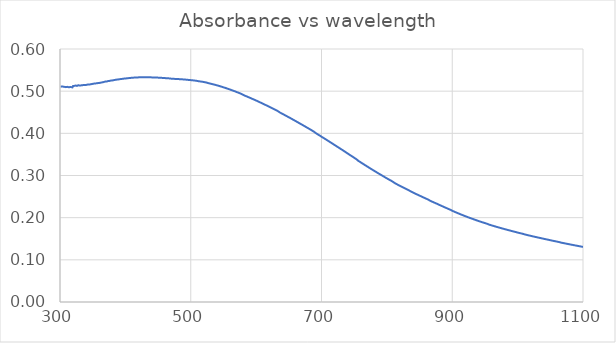
| Category | Series 0 |
|---|---|
| 1100.0 | 0.131 |
| 1099.0 | 0.131 |
| 1098.0 | 0.131 |
| 1097.0 | 0.131 |
| 1096.0 | 0.132 |
| 1095.0 | 0.132 |
| 1094.0 | 0.132 |
| 1093.0 | 0.133 |
| 1092.0 | 0.133 |
| 1091.0 | 0.133 |
| 1090.0 | 0.134 |
| 1089.0 | 0.134 |
| 1088.0 | 0.134 |
| 1087.0 | 0.135 |
| 1086.0 | 0.135 |
| 1085.0 | 0.135 |
| 1084.0 | 0.135 |
| 1083.0 | 0.136 |
| 1082.0 | 0.136 |
| 1081.0 | 0.136 |
| 1080.0 | 0.137 |
| 1079.0 | 0.137 |
| 1078.0 | 0.137 |
| 1077.0 | 0.138 |
| 1076.0 | 0.138 |
| 1075.0 | 0.138 |
| 1074.0 | 0.139 |
| 1073.0 | 0.139 |
| 1072.0 | 0.139 |
| 1071.0 | 0.139 |
| 1070.0 | 0.14 |
| 1069.0 | 0.14 |
| 1068.0 | 0.14 |
| 1067.0 | 0.141 |
| 1066.0 | 0.141 |
| 1065.0 | 0.141 |
| 1064.0 | 0.142 |
| 1063.0 | 0.142 |
| 1062.0 | 0.143 |
| 1061.0 | 0.143 |
| 1060.0 | 0.143 |
| 1059.0 | 0.144 |
| 1058.0 | 0.144 |
| 1057.0 | 0.144 |
| 1056.0 | 0.145 |
| 1055.0 | 0.145 |
| 1054.0 | 0.145 |
| 1053.0 | 0.146 |
| 1052.0 | 0.146 |
| 1051.0 | 0.146 |
| 1050.0 | 0.147 |
| 1049.0 | 0.147 |
| 1048.0 | 0.147 |
| 1047.0 | 0.148 |
| 1046.0 | 0.148 |
| 1045.0 | 0.148 |
| 1044.0 | 0.149 |
| 1043.0 | 0.149 |
| 1042.0 | 0.149 |
| 1041.0 | 0.15 |
| 1040.0 | 0.15 |
| 1039.0 | 0.15 |
| 1038.0 | 0.151 |
| 1037.0 | 0.151 |
| 1036.0 | 0.151 |
| 1035.0 | 0.152 |
| 1034.0 | 0.152 |
| 1033.0 | 0.152 |
| 1032.0 | 0.153 |
| 1031.0 | 0.153 |
| 1030.0 | 0.153 |
| 1029.0 | 0.154 |
| 1028.0 | 0.154 |
| 1027.0 | 0.154 |
| 1026.0 | 0.155 |
| 1025.0 | 0.155 |
| 1024.0 | 0.155 |
| 1023.0 | 0.156 |
| 1022.0 | 0.156 |
| 1021.0 | 0.157 |
| 1020.0 | 0.157 |
| 1019.0 | 0.157 |
| 1018.0 | 0.158 |
| 1017.0 | 0.158 |
| 1016.0 | 0.158 |
| 1015.0 | 0.159 |
| 1014.0 | 0.159 |
| 1013.0 | 0.159 |
| 1012.0 | 0.16 |
| 1011.0 | 0.16 |
| 1010.0 | 0.161 |
| 1009.0 | 0.161 |
| 1008.0 | 0.162 |
| 1007.0 | 0.162 |
| 1006.0 | 0.162 |
| 1005.0 | 0.163 |
| 1004.0 | 0.163 |
| 1003.0 | 0.164 |
| 1002.0 | 0.164 |
| 1001.0 | 0.164 |
| 1000.0 | 0.165 |
| 999.0 | 0.165 |
| 998.0 | 0.166 |
| 997.0 | 0.166 |
| 996.0 | 0.166 |
| 995.0 | 0.167 |
| 994.0 | 0.167 |
| 993.0 | 0.168 |
| 992.0 | 0.168 |
| 991.0 | 0.168 |
| 990.0 | 0.169 |
| 989.0 | 0.169 |
| 988.0 | 0.17 |
| 987.0 | 0.17 |
| 986.0 | 0.17 |
| 985.0 | 0.171 |
| 984.0 | 0.171 |
| 983.0 | 0.172 |
| 982.0 | 0.172 |
| 981.0 | 0.172 |
| 980.0 | 0.173 |
| 979.0 | 0.173 |
| 978.0 | 0.174 |
| 977.0 | 0.174 |
| 976.0 | 0.175 |
| 975.0 | 0.175 |
| 974.0 | 0.175 |
| 973.0 | 0.176 |
| 972.0 | 0.176 |
| 971.0 | 0.177 |
| 970.0 | 0.177 |
| 969.0 | 0.178 |
| 968.0 | 0.178 |
| 967.0 | 0.179 |
| 966.0 | 0.179 |
| 965.0 | 0.18 |
| 964.0 | 0.18 |
| 963.0 | 0.18 |
| 962.0 | 0.181 |
| 961.0 | 0.181 |
| 960.0 | 0.182 |
| 959.0 | 0.182 |
| 958.0 | 0.183 |
| 957.0 | 0.183 |
| 956.0 | 0.184 |
| 955.0 | 0.185 |
| 954.0 | 0.185 |
| 953.0 | 0.186 |
| 952.0 | 0.186 |
| 951.0 | 0.187 |
| 950.0 | 0.187 |
| 949.0 | 0.188 |
| 948.0 | 0.188 |
| 947.0 | 0.189 |
| 946.0 | 0.189 |
| 945.0 | 0.19 |
| 944.0 | 0.19 |
| 943.0 | 0.191 |
| 942.0 | 0.191 |
| 941.0 | 0.192 |
| 940.0 | 0.192 |
| 939.0 | 0.193 |
| 938.0 | 0.193 |
| 937.0 | 0.194 |
| 936.0 | 0.194 |
| 935.0 | 0.195 |
| 934.0 | 0.195 |
| 933.0 | 0.196 |
| 932.0 | 0.197 |
| 931.0 | 0.197 |
| 930.0 | 0.198 |
| 929.0 | 0.198 |
| 928.0 | 0.199 |
| 927.0 | 0.199 |
| 926.0 | 0.2 |
| 925.0 | 0.201 |
| 924.0 | 0.201 |
| 923.0 | 0.202 |
| 922.0 | 0.202 |
| 921.0 | 0.203 |
| 920.0 | 0.204 |
| 919.0 | 0.204 |
| 918.0 | 0.205 |
| 917.0 | 0.205 |
| 916.0 | 0.206 |
| 915.0 | 0.207 |
| 914.0 | 0.207 |
| 913.0 | 0.208 |
| 912.0 | 0.208 |
| 911.0 | 0.209 |
| 910.0 | 0.21 |
| 909.0 | 0.21 |
| 908.0 | 0.211 |
| 907.0 | 0.212 |
| 906.0 | 0.212 |
| 905.0 | 0.213 |
| 904.0 | 0.214 |
| 903.0 | 0.214 |
| 902.0 | 0.215 |
| 901.0 | 0.216 |
| 900.0 | 0.216 |
| 899.0 | 0.218 |
| 898.0 | 0.218 |
| 897.0 | 0.219 |
| 896.0 | 0.219 |
| 895.0 | 0.22 |
| 894.0 | 0.221 |
| 893.0 | 0.222 |
| 892.0 | 0.222 |
| 891.0 | 0.223 |
| 890.0 | 0.224 |
| 889.0 | 0.224 |
| 888.0 | 0.225 |
| 887.0 | 0.226 |
| 886.0 | 0.226 |
| 885.0 | 0.227 |
| 884.0 | 0.228 |
| 883.0 | 0.228 |
| 882.0 | 0.229 |
| 881.0 | 0.23 |
| 880.0 | 0.23 |
| 879.0 | 0.231 |
| 878.0 | 0.232 |
| 877.0 | 0.233 |
| 876.0 | 0.233 |
| 875.0 | 0.234 |
| 874.0 | 0.235 |
| 873.0 | 0.235 |
| 872.0 | 0.236 |
| 871.0 | 0.237 |
| 870.0 | 0.237 |
| 869.0 | 0.238 |
| 868.0 | 0.239 |
| 867.0 | 0.24 |
| 866.0 | 0.24 |
| 865.0 | 0.241 |
| 864.0 | 0.242 |
| 863.0 | 0.243 |
| 862.0 | 0.244 |
| 861.0 | 0.244 |
| 860.0 | 0.245 |
| 859.0 | 0.246 |
| 858.0 | 0.247 |
| 857.0 | 0.247 |
| 856.0 | 0.248 |
| 855.0 | 0.249 |
| 854.0 | 0.249 |
| 853.0 | 0.25 |
| 852.0 | 0.251 |
| 851.0 | 0.252 |
| 850.0 | 0.252 |
| 849.0 | 0.253 |
| 848.0 | 0.254 |
| 847.0 | 0.254 |
| 846.0 | 0.255 |
| 845.0 | 0.256 |
| 844.0 | 0.257 |
| 843.0 | 0.257 |
| 842.0 | 0.258 |
| 841.0 | 0.259 |
| 840.0 | 0.26 |
| 839.0 | 0.26 |
| 838.0 | 0.261 |
| 837.0 | 0.262 |
| 836.0 | 0.263 |
| 835.0 | 0.264 |
| 834.0 | 0.264 |
| 833.0 | 0.265 |
| 832.0 | 0.266 |
| 831.0 | 0.267 |
| 830.0 | 0.268 |
| 829.0 | 0.269 |
| 828.0 | 0.269 |
| 827.0 | 0.27 |
| 826.0 | 0.271 |
| 825.0 | 0.272 |
| 824.0 | 0.272 |
| 823.0 | 0.273 |
| 822.0 | 0.274 |
| 821.0 | 0.275 |
| 820.0 | 0.275 |
| 819.0 | 0.276 |
| 818.0 | 0.277 |
| 817.0 | 0.278 |
| 816.0 | 0.279 |
| 815.0 | 0.28 |
| 814.0 | 0.28 |
| 813.0 | 0.281 |
| 812.0 | 0.282 |
| 811.0 | 0.283 |
| 810.0 | 0.284 |
| 809.0 | 0.285 |
| 808.0 | 0.286 |
| 807.0 | 0.287 |
| 806.0 | 0.288 |
| 805.0 | 0.289 |
| 804.0 | 0.29 |
| 803.0 | 0.291 |
| 802.0 | 0.291 |
| 801.0 | 0.292 |
| 800.0 | 0.293 |
| 799.0 | 0.294 |
| 798.0 | 0.295 |
| 797.0 | 0.296 |
| 796.0 | 0.297 |
| 795.0 | 0.298 |
| 794.0 | 0.299 |
| 793.0 | 0.3 |
| 792.0 | 0.301 |
| 791.0 | 0.301 |
| 790.0 | 0.302 |
| 789.0 | 0.303 |
| 788.0 | 0.304 |
| 787.0 | 0.305 |
| 786.0 | 0.306 |
| 785.0 | 0.307 |
| 784.0 | 0.308 |
| 783.0 | 0.309 |
| 782.0 | 0.31 |
| 781.0 | 0.311 |
| 780.0 | 0.312 |
| 779.0 | 0.313 |
| 778.0 | 0.314 |
| 777.0 | 0.314 |
| 776.0 | 0.315 |
| 775.0 | 0.316 |
| 774.0 | 0.317 |
| 773.0 | 0.318 |
| 772.0 | 0.319 |
| 771.0 | 0.32 |
| 770.0 | 0.321 |
| 769.0 | 0.322 |
| 768.0 | 0.323 |
| 767.0 | 0.324 |
| 766.0 | 0.325 |
| 765.0 | 0.326 |
| 764.0 | 0.327 |
| 763.0 | 0.328 |
| 762.0 | 0.329 |
| 761.0 | 0.33 |
| 760.0 | 0.331 |
| 759.0 | 0.332 |
| 758.0 | 0.333 |
| 757.0 | 0.334 |
| 756.0 | 0.335 |
| 755.0 | 0.337 |
| 754.0 | 0.338 |
| 753.0 | 0.339 |
| 752.0 | 0.34 |
| 751.0 | 0.341 |
| 750.0 | 0.342 |
| 749.0 | 0.343 |
| 748.0 | 0.344 |
| 747.0 | 0.345 |
| 746.0 | 0.346 |
| 745.0 | 0.347 |
| 744.0 | 0.348 |
| 743.0 | 0.349 |
| 742.0 | 0.35 |
| 741.0 | 0.351 |
| 740.0 | 0.352 |
| 739.0 | 0.353 |
| 738.0 | 0.354 |
| 737.0 | 0.355 |
| 736.0 | 0.356 |
| 735.0 | 0.357 |
| 734.0 | 0.358 |
| 733.0 | 0.359 |
| 732.0 | 0.36 |
| 731.0 | 0.361 |
| 730.0 | 0.362 |
| 729.0 | 0.363 |
| 728.0 | 0.364 |
| 727.0 | 0.365 |
| 726.0 | 0.366 |
| 725.0 | 0.367 |
| 724.0 | 0.368 |
| 723.0 | 0.369 |
| 722.0 | 0.37 |
| 721.0 | 0.371 |
| 720.0 | 0.372 |
| 719.0 | 0.373 |
| 718.0 | 0.374 |
| 717.0 | 0.375 |
| 716.0 | 0.376 |
| 715.0 | 0.377 |
| 714.0 | 0.378 |
| 713.0 | 0.379 |
| 712.0 | 0.38 |
| 711.0 | 0.381 |
| 710.0 | 0.382 |
| 709.0 | 0.383 |
| 708.0 | 0.384 |
| 707.0 | 0.385 |
| 706.0 | 0.386 |
| 705.0 | 0.387 |
| 704.0 | 0.388 |
| 703.0 | 0.389 |
| 702.0 | 0.39 |
| 701.0 | 0.391 |
| 700.0 | 0.392 |
| 699.0 | 0.393 |
| 698.0 | 0.394 |
| 697.0 | 0.395 |
| 696.0 | 0.396 |
| 695.0 | 0.397 |
| 694.0 | 0.398 |
| 693.0 | 0.399 |
| 692.0 | 0.4 |
| 691.0 | 0.401 |
| 690.0 | 0.402 |
| 689.0 | 0.403 |
| 688.0 | 0.404 |
| 687.0 | 0.405 |
| 686.0 | 0.406 |
| 685.0 | 0.407 |
| 684.0 | 0.408 |
| 683.0 | 0.409 |
| 682.0 | 0.41 |
| 681.0 | 0.411 |
| 680.0 | 0.412 |
| 679.0 | 0.413 |
| 678.0 | 0.414 |
| 677.0 | 0.414 |
| 676.0 | 0.415 |
| 675.0 | 0.416 |
| 674.0 | 0.417 |
| 673.0 | 0.418 |
| 672.0 | 0.419 |
| 671.0 | 0.42 |
| 670.0 | 0.421 |
| 669.0 | 0.422 |
| 668.0 | 0.422 |
| 667.0 | 0.423 |
| 666.0 | 0.424 |
| 665.0 | 0.425 |
| 664.0 | 0.426 |
| 663.0 | 0.427 |
| 662.0 | 0.428 |
| 661.0 | 0.429 |
| 660.0 | 0.429 |
| 659.0 | 0.43 |
| 658.0 | 0.431 |
| 657.0 | 0.432 |
| 656.0 | 0.433 |
| 655.0 | 0.434 |
| 654.0 | 0.435 |
| 653.0 | 0.436 |
| 652.0 | 0.436 |
| 651.0 | 0.437 |
| 650.0 | 0.438 |
| 649.0 | 0.439 |
| 648.0 | 0.44 |
| 647.0 | 0.441 |
| 646.0 | 0.441 |
| 645.0 | 0.442 |
| 644.0 | 0.443 |
| 643.0 | 0.444 |
| 642.0 | 0.445 |
| 641.0 | 0.446 |
| 640.0 | 0.446 |
| 639.0 | 0.447 |
| 638.0 | 0.448 |
| 637.0 | 0.449 |
| 636.0 | 0.45 |
| 635.0 | 0.45 |
| 634.0 | 0.452 |
| 633.0 | 0.453 |
| 632.0 | 0.454 |
| 631.0 | 0.455 |
| 630.0 | 0.455 |
| 629.0 | 0.456 |
| 628.0 | 0.457 |
| 627.0 | 0.458 |
| 626.0 | 0.458 |
| 625.0 | 0.459 |
| 624.0 | 0.46 |
| 623.0 | 0.461 |
| 622.0 | 0.462 |
| 621.0 | 0.462 |
| 620.0 | 0.463 |
| 619.0 | 0.464 |
| 618.0 | 0.465 |
| 617.0 | 0.465 |
| 616.0 | 0.466 |
| 615.0 | 0.467 |
| 614.0 | 0.468 |
| 613.0 | 0.468 |
| 612.0 | 0.469 |
| 611.0 | 0.47 |
| 610.0 | 0.471 |
| 609.0 | 0.471 |
| 608.0 | 0.472 |
| 607.0 | 0.473 |
| 606.0 | 0.473 |
| 605.0 | 0.474 |
| 604.0 | 0.475 |
| 603.0 | 0.476 |
| 602.0 | 0.476 |
| 601.0 | 0.477 |
| 600.0 | 0.478 |
| 599.0 | 0.479 |
| 598.0 | 0.479 |
| 597.0 | 0.48 |
| 596.0 | 0.481 |
| 595.0 | 0.481 |
| 594.0 | 0.482 |
| 593.0 | 0.483 |
| 592.0 | 0.483 |
| 591.0 | 0.484 |
| 590.0 | 0.485 |
| 589.0 | 0.485 |
| 588.0 | 0.486 |
| 587.0 | 0.487 |
| 586.0 | 0.487 |
| 585.0 | 0.488 |
| 584.0 | 0.489 |
| 583.0 | 0.489 |
| 582.0 | 0.49 |
| 581.0 | 0.491 |
| 580.0 | 0.491 |
| 579.0 | 0.492 |
| 578.0 | 0.493 |
| 577.0 | 0.494 |
| 576.0 | 0.494 |
| 575.0 | 0.495 |
| 574.0 | 0.496 |
| 573.0 | 0.496 |
| 572.0 | 0.497 |
| 571.0 | 0.498 |
| 570.0 | 0.498 |
| 569.0 | 0.499 |
| 568.0 | 0.499 |
| 567.0 | 0.5 |
| 566.0 | 0.5 |
| 565.0 | 0.501 |
| 564.0 | 0.502 |
| 563.0 | 0.502 |
| 562.0 | 0.503 |
| 561.0 | 0.503 |
| 560.0 | 0.504 |
| 559.0 | 0.504 |
| 558.0 | 0.505 |
| 557.0 | 0.506 |
| 556.0 | 0.506 |
| 555.0 | 0.507 |
| 554.0 | 0.507 |
| 553.0 | 0.508 |
| 552.0 | 0.508 |
| 551.0 | 0.509 |
| 550.0 | 0.509 |
| 549.0 | 0.51 |
| 548.0 | 0.51 |
| 547.0 | 0.511 |
| 546.0 | 0.511 |
| 545.0 | 0.512 |
| 544.0 | 0.512 |
| 543.0 | 0.513 |
| 542.0 | 0.513 |
| 541.0 | 0.513 |
| 540.0 | 0.514 |
| 539.0 | 0.514 |
| 538.0 | 0.515 |
| 537.0 | 0.515 |
| 536.0 | 0.516 |
| 535.0 | 0.516 |
| 534.0 | 0.516 |
| 533.0 | 0.517 |
| 532.0 | 0.517 |
| 531.0 | 0.518 |
| 530.0 | 0.518 |
| 529.0 | 0.518 |
| 528.0 | 0.519 |
| 527.0 | 0.519 |
| 526.0 | 0.519 |
| 525.0 | 0.52 |
| 524.0 | 0.52 |
| 523.0 | 0.521 |
| 522.0 | 0.521 |
| 521.0 | 0.521 |
| 520.0 | 0.522 |
| 519.0 | 0.522 |
| 518.0 | 0.522 |
| 517.0 | 0.522 |
| 516.0 | 0.523 |
| 515.0 | 0.523 |
| 514.0 | 0.523 |
| 513.0 | 0.523 |
| 512.0 | 0.524 |
| 511.0 | 0.524 |
| 510.0 | 0.524 |
| 509.0 | 0.524 |
| 508.0 | 0.525 |
| 507.0 | 0.525 |
| 506.0 | 0.525 |
| 505.0 | 0.525 |
| 504.0 | 0.526 |
| 503.0 | 0.526 |
| 502.0 | 0.526 |
| 501.0 | 0.526 |
| 500.0 | 0.526 |
| 499.0 | 0.526 |
| 498.0 | 0.526 |
| 497.0 | 0.527 |
| 496.0 | 0.527 |
| 495.0 | 0.527 |
| 494.0 | 0.527 |
| 493.0 | 0.527 |
| 492.0 | 0.527 |
| 491.0 | 0.528 |
| 490.0 | 0.528 |
| 489.0 | 0.528 |
| 488.0 | 0.528 |
| 487.0 | 0.528 |
| 486.0 | 0.528 |
| 485.0 | 0.528 |
| 484.0 | 0.528 |
| 483.0 | 0.528 |
| 482.0 | 0.529 |
| 481.0 | 0.529 |
| 480.0 | 0.529 |
| 479.0 | 0.529 |
| 478.0 | 0.529 |
| 477.0 | 0.529 |
| 476.0 | 0.529 |
| 475.0 | 0.529 |
| 474.0 | 0.529 |
| 473.0 | 0.529 |
| 472.0 | 0.529 |
| 471.0 | 0.53 |
| 470.0 | 0.53 |
| 469.0 | 0.53 |
| 468.0 | 0.53 |
| 467.0 | 0.53 |
| 466.0 | 0.53 |
| 465.0 | 0.531 |
| 464.0 | 0.531 |
| 463.0 | 0.531 |
| 462.0 | 0.531 |
| 461.0 | 0.531 |
| 460.0 | 0.531 |
| 459.0 | 0.531 |
| 458.0 | 0.531 |
| 457.0 | 0.531 |
| 456.0 | 0.532 |
| 455.0 | 0.532 |
| 454.0 | 0.532 |
| 453.0 | 0.532 |
| 452.0 | 0.532 |
| 451.0 | 0.532 |
| 450.0 | 0.532 |
| 449.0 | 0.532 |
| 448.0 | 0.532 |
| 447.0 | 0.532 |
| 446.0 | 0.532 |
| 445.0 | 0.532 |
| 444.0 | 0.532 |
| 443.0 | 0.533 |
| 442.0 | 0.533 |
| 441.0 | 0.533 |
| 440.0 | 0.533 |
| 439.0 | 0.533 |
| 438.0 | 0.533 |
| 437.0 | 0.533 |
| 436.0 | 0.533 |
| 435.0 | 0.533 |
| 434.0 | 0.533 |
| 433.0 | 0.533 |
| 432.0 | 0.533 |
| 431.0 | 0.533 |
| 430.0 | 0.533 |
| 429.0 | 0.533 |
| 428.0 | 0.533 |
| 427.0 | 0.533 |
| 426.0 | 0.533 |
| 425.0 | 0.533 |
| 424.0 | 0.533 |
| 423.0 | 0.533 |
| 422.0 | 0.533 |
| 421.0 | 0.533 |
| 420.0 | 0.533 |
| 419.0 | 0.533 |
| 418.0 | 0.533 |
| 417.0 | 0.532 |
| 416.0 | 0.532 |
| 415.0 | 0.532 |
| 414.0 | 0.532 |
| 413.0 | 0.532 |
| 412.0 | 0.532 |
| 411.0 | 0.532 |
| 410.0 | 0.532 |
| 409.0 | 0.532 |
| 408.0 | 0.531 |
| 407.0 | 0.531 |
| 406.0 | 0.531 |
| 405.0 | 0.531 |
| 404.0 | 0.531 |
| 403.0 | 0.531 |
| 402.0 | 0.53 |
| 401.0 | 0.53 |
| 400.0 | 0.53 |
| 399.0 | 0.53 |
| 398.0 | 0.53 |
| 397.0 | 0.53 |
| 396.0 | 0.529 |
| 395.0 | 0.529 |
| 394.0 | 0.529 |
| 393.0 | 0.529 |
| 392.0 | 0.529 |
| 391.0 | 0.528 |
| 390.0 | 0.528 |
| 389.0 | 0.528 |
| 388.0 | 0.528 |
| 387.0 | 0.527 |
| 386.0 | 0.527 |
| 385.0 | 0.527 |
| 384.0 | 0.527 |
| 383.0 | 0.526 |
| 382.0 | 0.526 |
| 381.0 | 0.526 |
| 380.0 | 0.525 |
| 379.0 | 0.525 |
| 378.0 | 0.525 |
| 377.0 | 0.525 |
| 376.0 | 0.524 |
| 375.0 | 0.524 |
| 374.0 | 0.524 |
| 373.0 | 0.524 |
| 372.0 | 0.523 |
| 371.0 | 0.523 |
| 370.0 | 0.523 |
| 369.0 | 0.522 |
| 368.0 | 0.522 |
| 367.0 | 0.522 |
| 366.0 | 0.521 |
| 365.0 | 0.521 |
| 364.0 | 0.521 |
| 363.0 | 0.52 |
| 362.0 | 0.52 |
| 361.0 | 0.52 |
| 360.0 | 0.519 |
| 359.0 | 0.519 |
| 358.0 | 0.519 |
| 357.0 | 0.519 |
| 356.0 | 0.519 |
| 355.0 | 0.519 |
| 354.0 | 0.518 |
| 353.0 | 0.518 |
| 352.0 | 0.518 |
| 351.0 | 0.518 |
| 350.0 | 0.517 |
| 349.0 | 0.517 |
| 348.0 | 0.517 |
| 347.0 | 0.517 |
| 346.0 | 0.516 |
| 345.0 | 0.516 |
| 344.0 | 0.516 |
| 343.0 | 0.515 |
| 342.0 | 0.516 |
| 341.0 | 0.516 |
| 340.0 | 0.515 |
| 339.0 | 0.515 |
| 338.0 | 0.515 |
| 337.0 | 0.515 |
| 336.0 | 0.515 |
| 335.0 | 0.514 |
| 334.0 | 0.514 |
| 333.0 | 0.514 |
| 332.0 | 0.514 |
| 331.0 | 0.513 |
| 330.0 | 0.513 |
| 329.0 | 0.513 |
| 328.0 | 0.514 |
| 327.0 | 0.514 |
| 326.0 | 0.513 |
| 325.0 | 0.513 |
| 324.0 | 0.513 |
| 323.0 | 0.513 |
| 322.0 | 0.513 |
| 321.0 | 0.514 |
| 320.0 | 0.512 |
| 319.0 | 0.509 |
| 318.0 | 0.509 |
| 317.0 | 0.51 |
| 316.0 | 0.51 |
| 315.0 | 0.51 |
| 314.0 | 0.51 |
| 313.0 | 0.509 |
| 312.0 | 0.509 |
| 311.0 | 0.51 |
| 310.0 | 0.51 |
| 309.0 | 0.51 |
| 308.0 | 0.51 |
| 307.0 | 0.51 |
| 306.0 | 0.511 |
| 305.0 | 0.511 |
| 304.0 | 0.511 |
| 303.0 | 0.511 |
| 302.0 | 0.511 |
| 301.0 | 0.511 |